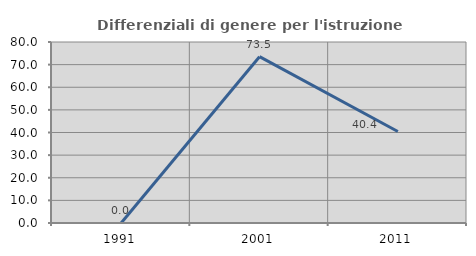
| Category | Differenziali di genere per l'istruzione superiore |
|---|---|
| 1991.0 | 0 |
| 2001.0 | 73.509 |
| 2011.0 | 40.435 |